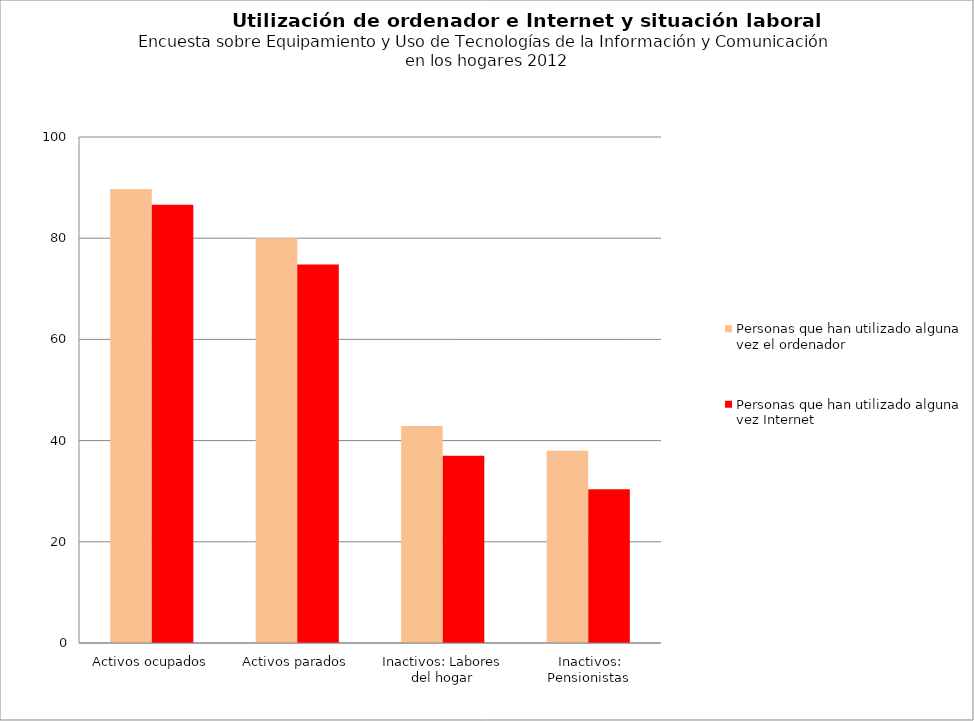
| Category | Personas que han utilizado alguna vez el ordenador | Personas que han utilizado alguna vez Internet |
|---|---|---|
| Activos ocupados | 89.7 | 86.6 |
| Activos parados | 80 | 74.8 |
| Inactivos: Labores del hogar | 42.9 | 37 |
|  Inactivos: Pensionistas | 38 | 30.4 |